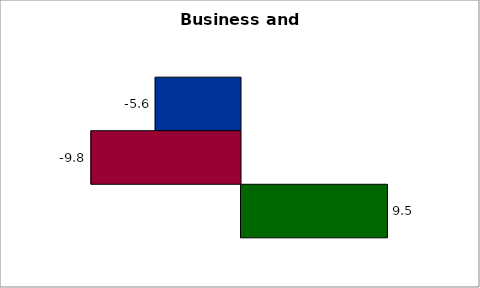
| Category | 50 states and D.C. | SREB states | State |
|---|---|---|---|
| 0 | -5.564 | -9.758 | 9.55 |